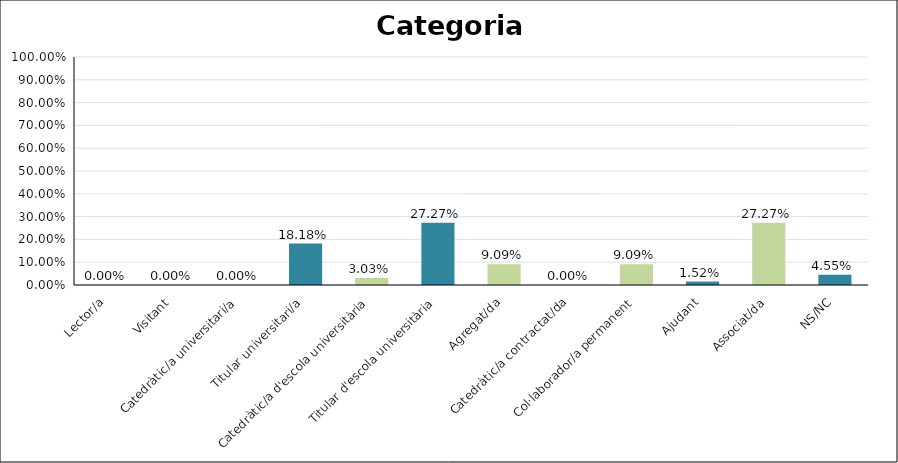
| Category | Series 0 |
|---|---|
| Lector/a | 0 |
| Visitant | 0 |
| Catedràtic/a universitari/a | 0 |
| Titular universitari/a | 0.182 |
| Catedràtic/a d'escola universitària | 0.03 |
| Titular d'escola universitària | 0.273 |
| Agregat/da | 0.091 |
| Catedràtic/a contractat/da | 0 |
| Col·laborador/a permanent | 0.091 |
| Ajudant | 0.015 |
| Associat/da | 0.273 |
| NS/NC | 0.045 |